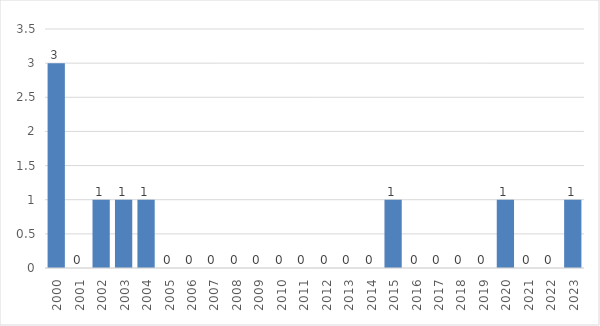
| Category | Series 0 |
|---|---|
| 2000.0 | 3 |
| 2001.0 | 0 |
| 2002.0 | 1 |
| 2003.0 | 1 |
| 2004.0 | 1 |
| 2005.0 | 0 |
| 2006.0 | 0 |
| 2007.0 | 0 |
| 2008.0 | 0 |
| 2009.0 | 0 |
| 2010.0 | 0 |
| 2011.0 | 0 |
| 2012.0 | 0 |
| 2013.0 | 0 |
| 2014.0 | 0 |
| 2015.0 | 1 |
| 2016.0 | 0 |
| 2017.0 | 0 |
| 2018.0 | 0 |
| 2019.0 | 0 |
| 2020.0 | 1 |
| 2021.0 | 0 |
| 2022.0 | 0 |
| 2023.0 | 1 |